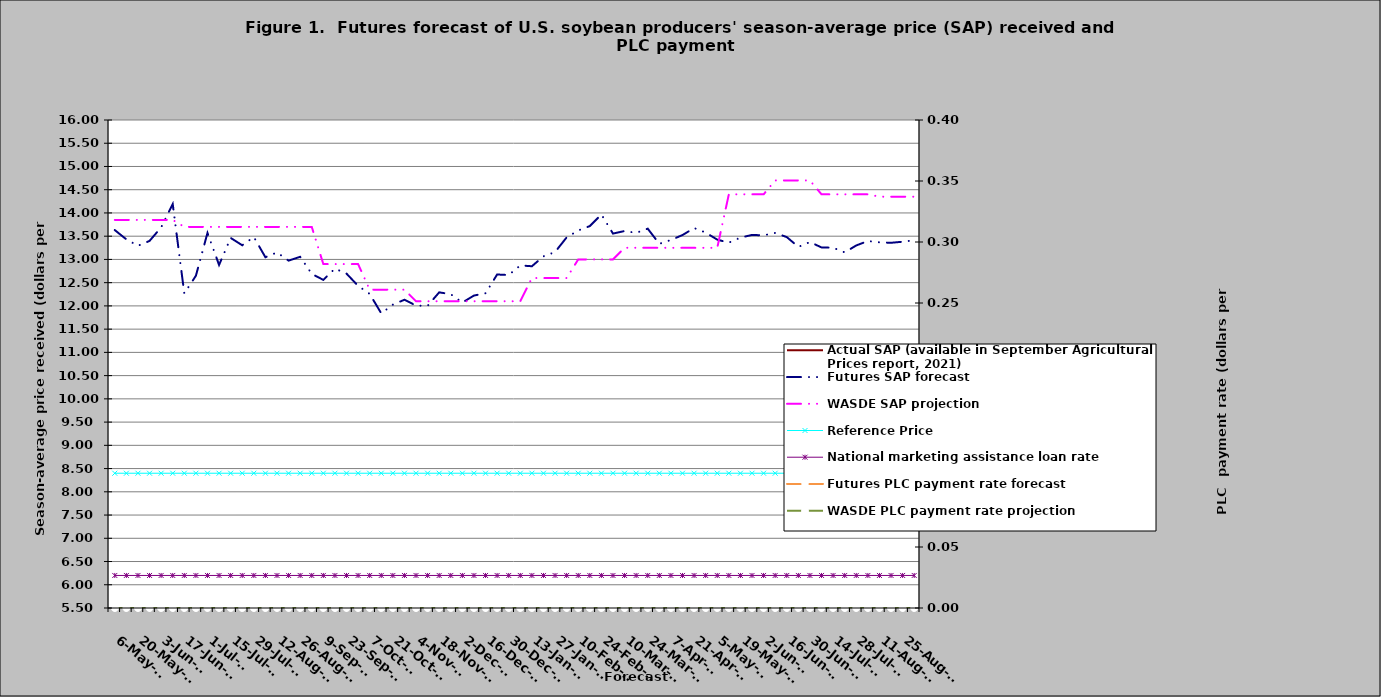
| Category | Actual SAP (available in September Agricultural Prices report, 2021) | Futures SAP forecast | WASDE SAP projection | Reference Price  | National marketing assistance loan rate  |
|---|---|---|---|---|---|
| 2021-05-06 |  | 13.631 | 13.85 | 8.4 | 6.2 |
| 2021-05-13 |  | 13.432 | 13.85 | 8.4 | 6.2 |
| 2021-05-20 |  | 13.293 | 13.85 | 8.4 | 6.2 |
| 2021-05-27 |  | 13.398 | 13.85 | 8.4 | 6.2 |
| 2021-06-03 |  | 13.689 | 13.85 | 8.4 | 6.2 |
| 2021-06-10 |  | 14.193 | 13.85 | 8.4 | 6.2 |
| 2021-06-17 |  | 12.269 | 13.7 | 8.4 | 6.2 |
| 2021-06-24 |  | 12.649 | 13.7 | 8.4 | 6.2 |
| 2021-07-01 |  | 13.571 | 13.7 | 8.4 | 6.2 |
| 2021-07-08 |  | 12.881 | 13.7 | 8.4 | 6.2 |
| 2021-07-15 |  | 13.463 | 13.7 | 8.4 | 6.2 |
| 2021-07-22 |  | 13.305 | 13.7 | 8.4 | 6.2 |
| 2021-07-29 |  | 13.482 | 13.7 | 8.4 | 6.2 |
| 2021-08-05 |  | 13.047 | 13.7 | 8.4 | 6.2 |
| 2021-08-12 |  | 13.15 | 13.7 | 8.4 | 6.2 |
| 2021-08-19 |  | 12.974 | 13.7 | 8.4 | 6.2 |
| 2021-08-26 |  | 13.057 | 13.7 | 8.4 | 6.2 |
| 2021-09-02 |  | 12.689 | 13.7 | 8.4 | 6.2 |
| 2021-09-09 |  | 12.56 | 12.9 | 8.4 | 6.2 |
| 2021-09-16 |  | 12.802 | 12.9 | 8.4 | 6.2 |
| 2021-09-23 |  | 12.695 | 12.9 | 8.4 | 6.2 |
| 2021-09-30 |  | 12.431 | 12.9 | 8.4 | 6.2 |
| 2021-10-07 |  | 12.258 | 12.35 | 8.4 | 6.2 |
| 2021-10-14 |  | 11.84 | 12.35 | 8.4 | 6.2 |
| 2021-10-21 |  | 12.027 | 12.35 | 8.4 | 6.2 |
| 2021-10-28 |  | 12.132 | 12.35 | 8.4 | 6.2 |
| 2021-11-04 |  | 12.007 | 12.1 | 8.4 | 6.2 |
| 2021-11-11 |  | 12.001 | 12.1 | 8.4 | 6.2 |
| 2021-11-18 |  | 12.292 | 12.1 | 8.4 | 6.2 |
| 2021-11-25 |  | 12.251 | 12.1 | 8.4 | 6.2 |
| 2021-12-02 |  | 12.072 | 12.1 | 8.4 | 6.2 |
| 2021-12-09 |  | 12.223 | 12.1 | 8.4 | 6.2 |
| 2021-12-16 |  | 12.272 | 12.1 | 8.4 | 6.2 |
| 2021-12-23 |  | 12.676 | 12.1 | 8.4 | 6.2 |
| 2021-12-30 |  | 12.664 | 12.1 | 8.4 | 6.2 |
| 2022-01-06 |  | 12.87 | 12.1 | 8.4 | 6.2 |
| 2022-01-13 |  | 12.853 | 12.6 | 8.4 | 6.2 |
| 2022-01-20 |  | 13.067 | 12.6 | 8.4 | 6.2 |
| 2022-01-27 |  | 13.159 | 12.6 | 8.4 | 6.2 |
| 2022-02-03 |  | 13.474 | 12.6 | 8.4 | 6.2 |
| 2022-02-10 |  | 13.622 | 13 | 8.4 | 6.2 |
| 2022-02-17 |  | 13.717 | 13 | 8.4 | 6.2 |
| 2022-02-24 |  | 13.968 | 13 | 8.4 | 6.2 |
| 2022-03-03 |  | 13.556 | 13 | 8.4 | 6.2 |
| 2022-03-10 |  | 13.611 | 13.25 | 8.4 | 6.2 |
| 2022-03-17 |  | 13.572 | 13.25 | 8.4 | 6.2 |
| 2022-03-24 |  | 13.662 | 13.25 | 8.4 | 6.2 |
| 2022-03-31 |  | 13.335 | 13.25 | 8.4 | 6.2 |
| 2022-04-07 |  | 13.419 | 13.25 | 8.4 | 6.2 |
| 2022-04-14 |  | 13.524 | 13.25 | 8.4 | 6.2 |
| 2022-04-21 |  | 13.675 | 13.25 | 8.4 | 6.2 |
| 2022-04-28 |  | 13.578 | 13.25 | 8.4 | 6.2 |
| 2022-05-05 |  | 13.426 | 13.25 | 8.4 | 6.2 |
| 2022-05-12 |  | 13.36 | 14.4 | 8.4 | 6.2 |
| 2022-05-19 |  | 13.47 | 14.4 | 8.4 | 6.2 |
| 2022-05-26 |  | 13.527 | 14.4 | 8.4 | 6.2 |
| 2022-06-02 |  | 13.518 | 14.4 | 8.4 | 6.2 |
| 2022-06-09 |  | 13.571 | 14.7 | 8.4 | 6.2 |
| 2022-06-16 |  | 13.481 | 14.7 | 8.4 | 6.2 |
| 2022-06-23 |  | 13.27 | 14.7 | 8.4 | 6.2 |
| 2022-06-30 |  | 13.373 | 14.7 | 8.4 | 6.2 |
| 2022-07-07 |  | 13.258 | 14.4 | 8.4 | 6.2 |
| 2022-07-14 |  | 13.252 | 14.4 | 8.4 | 6.2 |
| 2022-07-21 |  | 13.153 | 14.4 | 8.4 | 6.2 |
| 2022-07-28 |  | 13.301 | 14.4 | 8.4 | 6.2 |
| 2022-08-04 |  | 13.397 | 14.4 | 8.4 | 6.2 |
| 2022-08-11 |  | 13.368 | 14.35 | 8.4 | 6.2 |
| 2022-08-18 |  | 13.358 | 14.35 | 8.4 | 6.2 |
| 2022-08-25 |  | 13.381 | 14.35 | 8.4 | 6.2 |
| 2022-09-01 |  | 13.413 | 14.35 | 8.4 | 6.2 |